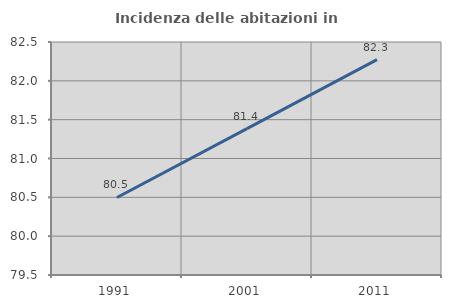
| Category | Incidenza delle abitazioni in proprietà  |
|---|---|
| 1991.0 | 80.498 |
| 2001.0 | 81.385 |
| 2011.0 | 82.273 |